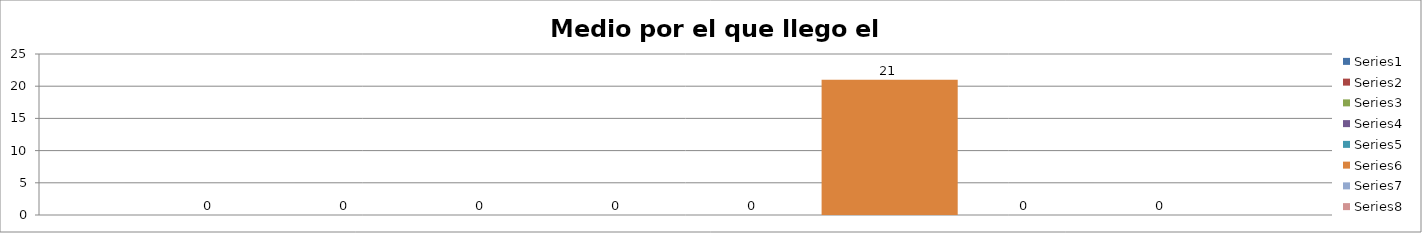
| Category | Series 0 | Series 1 | Series 2 | Series 3 | Series 4 | Series 5 | Series 6 | Series 7 |
|---|---|---|---|---|---|---|---|---|
| 0 | 0 | 0 | 0 | 0 | 0 | 21 | 0 | 0 |